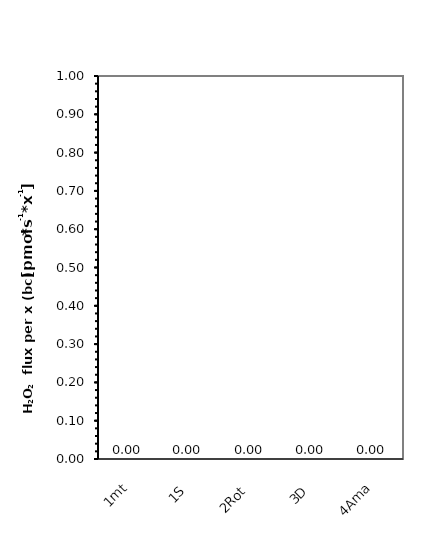
| Category | #VALUE! |
|---|---|
| 1mt | 0 |
| 1S | 0 |
| 2Rot | 0 |
| 3D | 0 |
| 4Ama | 0 |